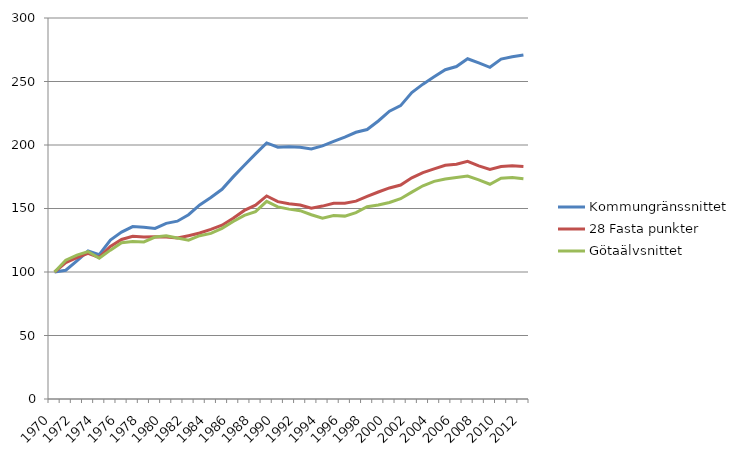
| Category | Kommungränssnittet | 28 Fasta punkter | Götaälvsnittet |
|---|---|---|---|
| 1970.0 | 100 | 100 | 100 |
| 1971.0 | 101.4 | 107.4 | 109.3 |
| 1972.0 | 108.7 | 111.3 | 113.3 |
| 1973.0 | 116.5 | 114.7 | 116.1 |
| 1974.0 | 113.6 | 111.5 | 110.8 |
| 1975.0 | 125.2 | 120.1 | 117.2 |
| 1976.0 | 131.4 | 125.6 | 123.1 |
| 1977.0 | 135.8 | 128.1 | 124.1 |
| 1978.0 | 135.3 | 127.6 | 123.7 |
| 1979.0 | 134.3 | 127.8 | 127.5 |
| 1980.0 | 138.3 | 127.6 | 128.6 |
| 1981.0 | 140 | 126.7 | 126.7 |
| 1982.0 | 145.1 | 128.6 | 125.1 |
| 1983.0 | 152.8 | 130.7 | 128.6 |
| 1984.0 | 158.6 | 133.6 | 130.4 |
| 1985.0 | 165.1 | 136.8 | 134.4 |
| 1986.0 | 174.9 | 142.3 | 139.8 |
| 1987.0 | 184.1 | 148.5 | 144.6 |
| 1988.0 | 193 | 152.6 | 147.5 |
| 1989.0 | 201.6 | 159.9 | 155.6 |
| 1990.0 | 198.3 | 155.4 | 151.3 |
| 1991.0 | 198.7 | 153.8 | 149.5 |
| 1992.0 | 198.2 | 152.8 | 148.3 |
| 1993.0 | 196.8 | 150.3 | 145.1 |
| 1994.0 | 199.3 | 151.9 | 142.3 |
| 1995.0 | 202.8 | 154.1 | 144.5 |
| 1996.0 | 206.2 | 154.2 | 144 |
| 1997.0 | 210 | 155.8 | 146.7 |
| 1998.0 | 212.2 | 159.5 | 151.4 |
| 1999.0 | 218.9 | 163 | 152.7 |
| 2000.0 | 226.6 | 166.2 | 154.7 |
| 2001.0 | 231 | 168.5 | 157.7 |
| 2002.0 | 241.3 | 174.2 | 162.9 |
| 2003.0 | 247.9 | 178.2 | 167.9 |
| 2004.0 | 253.7 | 181.2 | 171.4 |
| 2005.0 | 259.3 | 184 | 173.3 |
| 2006.0 | 261.8 | 184.9 | 174.4 |
| 2007.0 | 267.9 | 187.2 | 175.5 |
| 2008.0 | 264.6 | 183.6 | 172.6 |
| 2009.0 | 261.2 | 180.7 | 169.1 |
| 2010.0 | 267.6 | 183 | 173.8 |
| 2011.0 | 269.5 | 183.6 | 174.4 |
| 2012.0 | 270.9 | 183 | 173.4 |